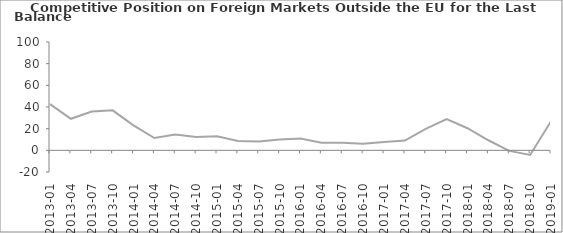
| Category | Balance |
|---|---|
| 2013-01 | 42.7 |
| 2013-04 | 29.1 |
| 2013-07 | 35.8 |
| 2013-10 | 36.9 |
| 2014-01 | 23 |
| 2014-04 | 11.4 |
| 2014-07 | 14.6 |
| 2014-10 | 12.4 |
| 2015-01 | 12.9 |
| 2015-04 | 8.6 |
| 2015-07 | 8.1 |
| 2015-10 | 9.9 |
| 2016-01 | 11 |
| 2016-04 | 7 |
| 2016-07 | 6.9 |
| 2016-10 | 6 |
| 2017-01 | 7.8 |
| 2017-04 | 9 |
| 2017-07 | 19.8 |
| 2017-10 | 28.8 |
| 2018-01 | 20.4 |
| 2018-04 | 9.3 |
| 2018-07 | -0.5 |
| 2018-10 | -4.3 |
| 2019-01 | 26.9 |